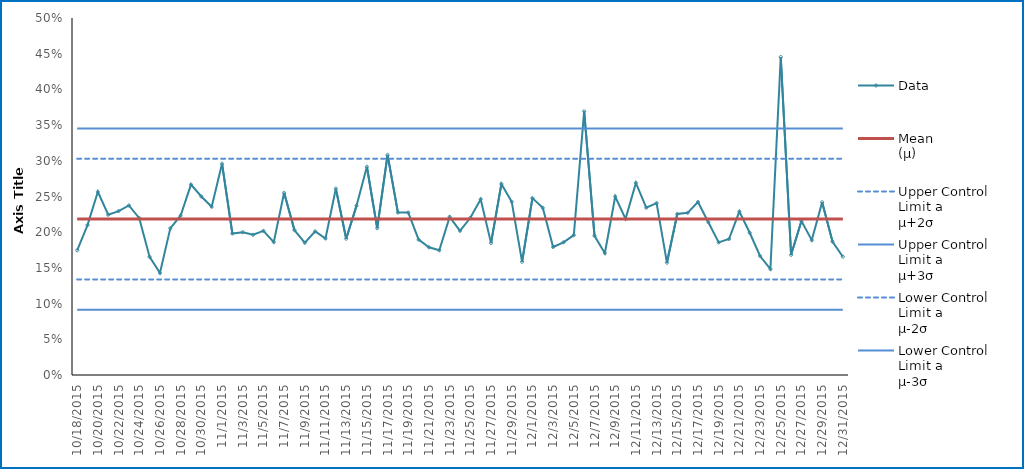
| Category | Data | Mean 
(μ) | Upper Control 
Limit a
μ+2σ | Upper Control 
Limit a
μ+3σ | Lower Control 
Limit a
μ-2σ | Lower Control 
Limit a
μ-3σ |
|---|---|---|---|---|---|---|
| 10/18/15 | 0.175 | 0.218 | 0.303 | 0.345 | 0.134 | 0.092 |
| 10/19/15 | 0.21 | 0.218 | 0.303 | 0.345 | 0.134 | 0.092 |
| 10/20/15 | 0.257 | 0.218 | 0.303 | 0.345 | 0.134 | 0.092 |
| 10/21/15 | 0.224 | 0.218 | 0.303 | 0.345 | 0.134 | 0.092 |
| 10/22/15 | 0.23 | 0.218 | 0.303 | 0.345 | 0.134 | 0.092 |
| 10/23/15 | 0.237 | 0.218 | 0.303 | 0.345 | 0.134 | 0.092 |
| 10/24/15 | 0.22 | 0.218 | 0.303 | 0.345 | 0.134 | 0.092 |
| 10/25/15 | 0.165 | 0.218 | 0.303 | 0.345 | 0.134 | 0.092 |
| 10/26/15 | 0.143 | 0.218 | 0.303 | 0.345 | 0.134 | 0.092 |
| 10/27/15 | 0.205 | 0.218 | 0.303 | 0.345 | 0.134 | 0.092 |
| 10/28/15 | 0.223 | 0.218 | 0.303 | 0.345 | 0.134 | 0.092 |
| 10/29/15 | 0.267 | 0.218 | 0.303 | 0.345 | 0.134 | 0.092 |
| 10/30/15 | 0.25 | 0.218 | 0.303 | 0.345 | 0.134 | 0.092 |
| 10/31/15 | 0.236 | 0.218 | 0.303 | 0.345 | 0.134 | 0.092 |
| 11/1/15 | 0.296 | 0.218 | 0.303 | 0.345 | 0.134 | 0.092 |
| 11/2/15 | 0.198 | 0.218 | 0.303 | 0.345 | 0.134 | 0.092 |
| 11/3/15 | 0.2 | 0.218 | 0.303 | 0.345 | 0.134 | 0.092 |
| 11/4/15 | 0.196 | 0.218 | 0.303 | 0.345 | 0.134 | 0.092 |
| 11/5/15 | 0.202 | 0.218 | 0.303 | 0.345 | 0.134 | 0.092 |
| 11/6/15 | 0.186 | 0.218 | 0.303 | 0.345 | 0.134 | 0.092 |
| 11/7/15 | 0.255 | 0.218 | 0.303 | 0.345 | 0.134 | 0.092 |
| 11/8/15 | 0.203 | 0.218 | 0.303 | 0.345 | 0.134 | 0.092 |
| 11/9/15 | 0.185 | 0.218 | 0.303 | 0.345 | 0.134 | 0.092 |
| 11/10/15 | 0.201 | 0.218 | 0.303 | 0.345 | 0.134 | 0.092 |
| 11/11/15 | 0.191 | 0.218 | 0.303 | 0.345 | 0.134 | 0.092 |
| 11/12/15 | 0.261 | 0.218 | 0.303 | 0.345 | 0.134 | 0.092 |
| 11/13/15 | 0.191 | 0.218 | 0.303 | 0.345 | 0.134 | 0.092 |
| 11/14/15 | 0.237 | 0.218 | 0.303 | 0.345 | 0.134 | 0.092 |
| 11/15/15 | 0.292 | 0.218 | 0.303 | 0.345 | 0.134 | 0.092 |
| 11/16/15 | 0.206 | 0.218 | 0.303 | 0.345 | 0.134 | 0.092 |
| 11/17/15 | 0.308 | 0.218 | 0.303 | 0.345 | 0.134 | 0.092 |
| 11/18/15 | 0.228 | 0.218 | 0.303 | 0.345 | 0.134 | 0.092 |
| 11/19/15 | 0.227 | 0.218 | 0.303 | 0.345 | 0.134 | 0.092 |
| 11/20/15 | 0.19 | 0.218 | 0.303 | 0.345 | 0.134 | 0.092 |
| 11/21/15 | 0.179 | 0.218 | 0.303 | 0.345 | 0.134 | 0.092 |
| 11/22/15 | 0.175 | 0.218 | 0.303 | 0.345 | 0.134 | 0.092 |
| 11/23/15 | 0.222 | 0.218 | 0.303 | 0.345 | 0.134 | 0.092 |
| 11/24/15 | 0.202 | 0.218 | 0.303 | 0.345 | 0.134 | 0.092 |
| 11/25/15 | 0.22 | 0.218 | 0.303 | 0.345 | 0.134 | 0.092 |
| 11/26/15 | 0.246 | 0.218 | 0.303 | 0.345 | 0.134 | 0.092 |
| 11/27/15 | 0.185 | 0.218 | 0.303 | 0.345 | 0.134 | 0.092 |
| 11/28/15 | 0.268 | 0.218 | 0.303 | 0.345 | 0.134 | 0.092 |
| 11/29/15 | 0.243 | 0.218 | 0.303 | 0.345 | 0.134 | 0.092 |
| 11/30/15 | 0.158 | 0.218 | 0.303 | 0.345 | 0.134 | 0.092 |
| 12/1/15 | 0.248 | 0.218 | 0.303 | 0.345 | 0.134 | 0.092 |
| 12/2/15 | 0.234 | 0.218 | 0.303 | 0.345 | 0.134 | 0.092 |
| 12/3/15 | 0.179 | 0.218 | 0.303 | 0.345 | 0.134 | 0.092 |
| 12/4/15 | 0.186 | 0.218 | 0.303 | 0.345 | 0.134 | 0.092 |
| 12/5/15 | 0.196 | 0.218 | 0.303 | 0.345 | 0.134 | 0.092 |
| 12/6/15 | 0.369 | 0.218 | 0.303 | 0.345 | 0.134 | 0.092 |
| 12/7/15 | 0.195 | 0.218 | 0.303 | 0.345 | 0.134 | 0.092 |
| 12/8/15 | 0.171 | 0.218 | 0.303 | 0.345 | 0.134 | 0.092 |
| 12/9/15 | 0.25 | 0.218 | 0.303 | 0.345 | 0.134 | 0.092 |
| 12/10/15 | 0.219 | 0.218 | 0.303 | 0.345 | 0.134 | 0.092 |
| 12/11/15 | 0.269 | 0.218 | 0.303 | 0.345 | 0.134 | 0.092 |
| 12/12/15 | 0.234 | 0.218 | 0.303 | 0.345 | 0.134 | 0.092 |
| 12/13/15 | 0.241 | 0.218 | 0.303 | 0.345 | 0.134 | 0.092 |
| 12/14/15 | 0.157 | 0.218 | 0.303 | 0.345 | 0.134 | 0.092 |
| 12/15/15 | 0.225 | 0.218 | 0.303 | 0.345 | 0.134 | 0.092 |
| 12/16/15 | 0.227 | 0.218 | 0.303 | 0.345 | 0.134 | 0.092 |
| 12/17/15 | 0.242 | 0.218 | 0.303 | 0.345 | 0.134 | 0.092 |
| 12/18/15 | 0.214 | 0.218 | 0.303 | 0.345 | 0.134 | 0.092 |
| 12/19/15 | 0.186 | 0.218 | 0.303 | 0.345 | 0.134 | 0.092 |
| 12/20/15 | 0.19 | 0.218 | 0.303 | 0.345 | 0.134 | 0.092 |
| 12/21/15 | 0.229 | 0.218 | 0.303 | 0.345 | 0.134 | 0.092 |
| 12/22/15 | 0.199 | 0.218 | 0.303 | 0.345 | 0.134 | 0.092 |
| 12/23/15 | 0.167 | 0.218 | 0.303 | 0.345 | 0.134 | 0.092 |
| 12/24/15 | 0.148 | 0.218 | 0.303 | 0.345 | 0.134 | 0.092 |
| 12/25/15 | 0.445 | 0.218 | 0.303 | 0.345 | 0.134 | 0.092 |
| 12/26/15 | 0.168 | 0.218 | 0.303 | 0.345 | 0.134 | 0.092 |
| 12/27/15 | 0.216 | 0.218 | 0.303 | 0.345 | 0.134 | 0.092 |
| 12/28/15 | 0.189 | 0.218 | 0.303 | 0.345 | 0.134 | 0.092 |
| 12/29/15 | 0.242 | 0.218 | 0.303 | 0.345 | 0.134 | 0.092 |
| 12/30/15 | 0.187 | 0.218 | 0.303 | 0.345 | 0.134 | 0.092 |
| 12/31/15 | 0.166 | 0.218 | 0.303 | 0.345 | 0.134 | 0.092 |